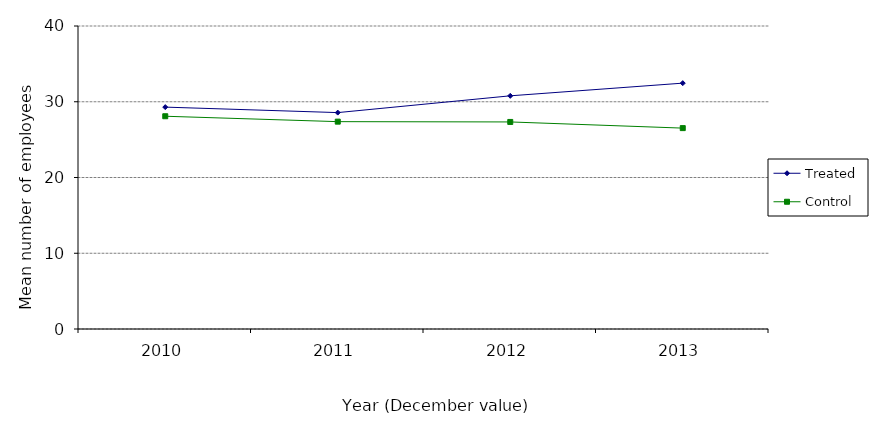
| Category | Treated | Control |
|---|---|---|
| 2010.0 | 29.291 | 28.087 |
| 2011.0 | 28.567 | 27.374 |
| 2012.0 | 30.782 | 27.334 |
| 2013.0 | 32.455 | 26.519 |